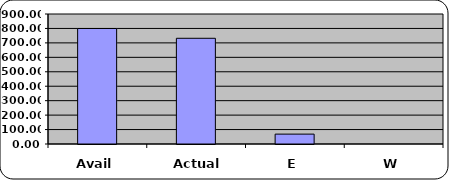
| Category | TOTAL |
|---|---|
| Avail | 799.6 |
| Actual | 731.87 |
| E | 68.4 |
| W | 0 |